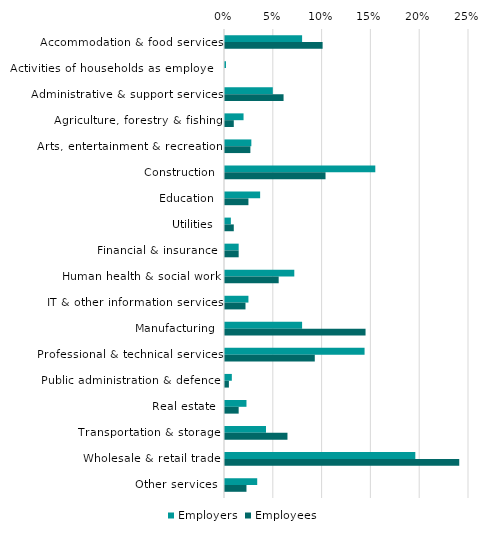
| Category | Employers | Employees |
|---|---|---|
| Accommodation & food services | 0.079 | 0.1 |
| Activities of households as employers | 0.001 | 0 |
| Administrative & support services | 0.049 | 0.06 |
| Agriculture, forestry & fishing | 0.019 | 0.009 |
| Arts, entertainment & recreation | 0.027 | 0.026 |
| Construction | 0.154 | 0.103 |
| Education | 0.036 | 0.024 |
| Utilities | 0.006 | 0.009 |
| Financial & insurance | 0.014 | 0.014 |
| Human health & social work | 0.071 | 0.055 |
| IT & other information services | 0.024 | 0.021 |
| Manufacturing | 0.079 | 0.144 |
| Professional & technical services | 0.143 | 0.092 |
| Public administration & defence | 0.007 | 0.004 |
| Real estate | 0.022 | 0.014 |
| Transportation & storage | 0.042 | 0.064 |
| Wholesale & retail trade | 0.195 | 0.24 |
| Other services | 0.033 | 0.022 |